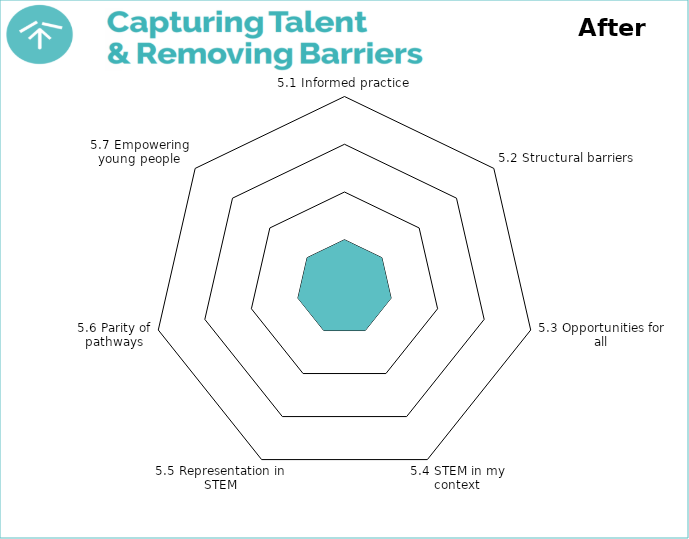
| Category | Theme 1: Leadership, Vision & Culture 

After |
|---|---|
| 5.1 Informed practice | 1 |
| 5.2 Structural barriers | 1 |
| 5.3 Opportunities for all | 1 |
| 5.4 STEM in my context | 1 |
| 5.5 Representation in STEM | 1 |
| 5.6 Parity of pathways | 1 |
| 5.7 Empowering young people | 1 |